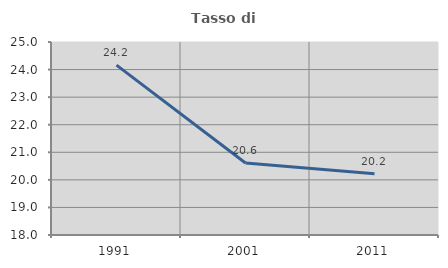
| Category | Tasso di occupazione   |
|---|---|
| 1991.0 | 24.161 |
| 2001.0 | 20.611 |
| 2011.0 | 20.225 |